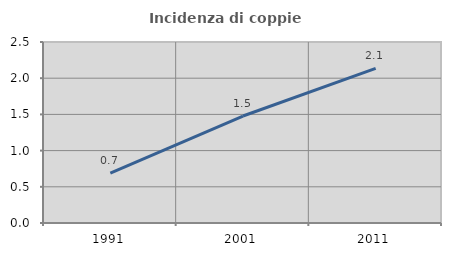
| Category | Incidenza di coppie miste |
|---|---|
| 1991.0 | 0.69 |
| 2001.0 | 1.478 |
| 2011.0 | 2.136 |